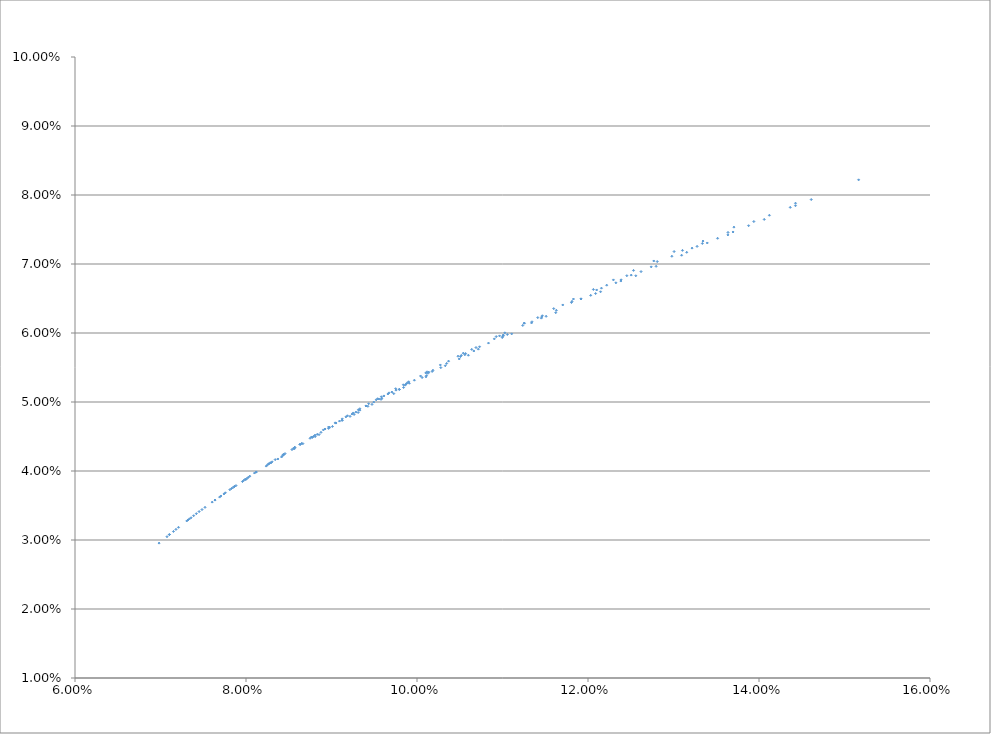
| Category | Series 0 |
|---|---|
| 0.06983636008721791 | 0.03 |
| 0.07321296698508514 | 0.033 |
| 0.0769154832485964 | 0.036 |
| 0.07997785496463364 | 0.039 |
| 0.08415444458381158 | 0.042 |
| 0.08854555599099252 | 0.045 |
| 0.0931208468194771 | 0.048 |
| 0.09728580807658857 | 0.051 |
| 0.10105093368734554 | 0.054 |
| 0.10600837576455632 | 0.057 |
| 0.11107246260650216 | 0.06 |
| 0.11622925557184198 | 0.063 |
| 0.12146694791660281 | 0.066 |
| 0.12558932758280886 | 0.068 |
| 0.13094777209999453 | 0.071 |
| 0.13636271674207887 | 0.074 |
| 0.14061042000080481 | 0.076 |
| 0.1461109918588979 | 0.079 |
| 0.15165218546152728 | 0.082 |
| 0.07520709262090239 | 0.035 |
| 0.07811109997916753 | 0.037 |
| 0.08118475187406657 | 0.04 |
| 0.08440951824992131 | 0.042 |
| 0.08776874411170317 | 0.045 |
| 0.09124758052759108 | 0.047 |
| 0.09425643843711162 | 0.049 |
| 0.09793064063376097 | 0.052 |
| 0.10278917864363259 | 0.055 |
| 0.10664408477517992 | 0.057 |
| 0.1105653165611652 | 0.06 |
| 0.11454606266667294 | 0.062 |
| 0.11918252663538204 | 0.065 |
| 0.12326699303621833 | 0.067 |
| 0.12739470682340148 | 0.07 |
| 0.13217250113139012 | 0.072 |
| 0.1363759343894203 | 0.075 |
| 0.13939632885941655 | 0.076 |
| 0.14426971287956494 | 0.079 |
| 0.08119837997552531 | 0.04 |
| 0.08341408122674225 | 0.042 |
| 0.08570699991151598 | 0.043 |
| 0.08807110520166594 | 0.045 |
| 0.09050081855835633 | 0.047 |
| 0.09403091175341087 | 0.049 |
| 0.09659542915287775 | 0.051 |
| 0.09969356472684747 | 0.053 |
| 0.10346750147447085 | 0.056 |
| 0.10731553341536762 | 0.058 |
| 0.11009419845601366 | 0.06 |
| 0.11466286487225733 | 0.062 |
| 0.11813151836169068 | 0.065 |
| 0.1210141778940968 | 0.066 |
| 0.12454154329315406 | 0.068 |
| 0.12809675105099408 | 0.07 |
| 0.13105163780686468 | 0.072 |
| 0.13344992779212045 | 0.073 |
| 0.13706601014152156 | 0.075 |
| 0.0876831088677513 | 0.045 |
| 0.0890496128885317 | 0.046 |
| 0.09044428812424603 | 0.047 |
| 0.09186585152725013 | 0.048 |
| 0.09434955100851594 | 0.05 |
| 0.09583315446196636 | 0.051 |
| 0.0984058230785593 | 0.052 |
| 0.10102706265197277 | 0.054 |
| 0.10479665394004016 | 0.057 |
| 0.10690201894000263 | 0.058 |
| 0.1102763901833215 | 0.06 |
| 0.11254878838623586 | 0.061 |
| 0.11598892962188571 | 0.064 |
| 0.11830195953426394 | 0.065 |
| 0.12062961984624947 | 0.066 |
| 0.1229710797652963 | 0.068 |
| 0.12532556583883112 | 0.069 |
| 0.12769235751129224 | 0.07 |
| 0.13007078303965222 | 0.072 |
| 0.07210471897982043 | 0.032 |
| 0.07485476774410539 | 0.034 |
| 0.07742456688625336 | 0.037 |
| 0.07958632861285458 | 0.038 |
| 0.0823649968755221 | 0.041 |
| 0.0837297905744902 | 0.042 |
| 0.08566873806577407 | 0.043 |
| 0.08809201803399128 | 0.045 |
| 0.0901147311488465 | 0.046 |
| 0.0926421131939057 | 0.048 |
| 0.09579456346753279 | 0.05 |
| 0.09842869725250963 | 0.052 |
| 0.10110819623747867 | 0.054 |
| 0.1049398266311822 | 0.056 |
| 0.10997292925458417 | 0.059 |
| 0.11510236664970565 | 0.062 |
| 0.12088918502349434 | 0.066 |
| 0.127964603068705 | 0.07 |
| 0.13878423363731474 | 0.076 |
| 0.07419333230184258 | 0.034 |
| 0.07758445596816674 | 0.037 |
| 0.07973149718323909 | 0.039 |
| 0.08250546909206392 | 0.041 |
| 0.08537687091153844 | 0.043 |
| 0.08833620216373828 | 0.045 |
| 0.0897791062581689 | 0.046 |
| 0.09285672760480697 | 0.049 |
| 0.09494673053093337 | 0.05 |
| 0.09754122612676223 | 0.052 |
| 0.10127248585393836 | 0.054 |
| 0.10508246678295992 | 0.057 |
| 0.10836242856405048 | 0.059 |
| 0.11344808579766806 | 0.062 |
| 0.11918252663538204 | 0.065 |
| 0.1262072312480995 | 0.069 |
| 0.1339509079931044 | 0.073 |
| 0.1442684059879261 | 0.078 |
| 0.071805157441001 | 0.032 |
| 0.07637612475291132 | 0.036 |
| 0.0798974665895412 | 0.039 |
| 0.08266606155634061 | 0.041 |
| 0.08553225805840652 | 0.043 |
| 0.08749255554156471 | 0.045 |
| 0.09050081855835633 | 0.047 |
| 0.0925481094665193 | 0.048 |
| 0.09403091175341087 | 0.049 |
| 0.09613250328568182 | 0.051 |
| 0.09873246331793796 | 0.053 |
| 0.10137943227481386 | 0.054 |
| 0.10517771630009919 | 0.057 |
| 0.10904722628878037 | 0.059 |
| 0.11237009253933523 | 0.061 |
| 0.11806758660124296 | 0.064 |
| 0.1250564254944429 | 0.068 |
| 0.13276145210145693 | 0.073 |
| 0.14365339760581322 | 0.078 |
| 0.07307488334763368 | 0.033 |
| 0.07864525492247328 | 0.038 |
| 0.0828466572633457 | 0.041 |
| 0.08570699991151598 | 0.043 |
| 0.08924613332408206 | 0.046 |
| 0.09126327962736273 | 0.048 |
| 0.0933130742349257 | 0.049 |
| 0.09539341254925009 | 0.05 |
| 0.09750233952166622 | 0.052 |
| 0.09901946513785995 | 0.053 |
| 0.10117583183396239 | 0.054 |
| 0.10273358083906191 | 0.055 |
| 0.10541585800032129 | 0.057 |
| 0.10926187459624649 | 0.059 |
| 0.11254878838623586 | 0.061 |
| 0.11705038572735076 | 0.064 |
| 0.1221867235269687 | 0.067 |
| 0.12981082858643442 | 0.071 |
| 0.07104134139625641 | 0.031 |
| 0.07338167223812109 | 0.033 |
| 0.07451899541465616 | 0.034 |
| 0.07706547687248512 | 0.036 |
| 0.07883027912738473 | 0.038 |
| 0.08011184513258454 | 0.039 |
| 0.08290517941054008 | 0.041 |
| 0.08427209422773109 | 0.042 |
| 0.08665273367164993 | 0.044 |
| 0.08965897359113091 | 0.046 |
| 0.09217025343647955 | 0.048 |
| 0.09473662724814456 | 0.05 |
| 0.09793064063376097 | 0.052 |
| 0.10059720167397965 | 0.054 |
| 0.10330649759338029 | 0.055 |
| 0.10717566761488692 | 0.058 |
| 0.1133965409596603 | 0.061 |
| 0.12031581829489889 | 0.065 |
| 0.070762003919566 | 0.03 |
| 0.0738779120938744 | 0.034 |
| 0.07637612475291132 | 0.036 |
| 0.07846601618025598 | 0.038 |
| 0.08026657934463673 | 0.039 |
| 0.08305490100544746 | 0.041 |
| 0.08440951824992131 | 0.042 |
| 0.08635398561765548 | 0.044 |
| 0.08876959764895355 | 0.046 |
| 0.09124758052759108 | 0.047 |
| 0.09331638573374304 | 0.049 |
| 0.09588979476083766 | 0.051 |
| 0.0991006490417232 | 0.053 |
| 0.10177208467573576 | 0.054 |
| 0.10559740226815872 | 0.057 |
| 0.1100259335774241 | 0.06 |
| 0.11630110484356831 | 0.063 |
| 0.12384121000109007 | 0.068 |
| 0.13696593198168544 | 0.075 |
| 0.07151640530641555 | 0.031 |
| 0.07604612397026823 | 0.035 |
| 0.07864525492247328 | 0.038 |
| 0.08044193789416654 | 0.039 |
| 0.08266606155634061 | 0.041 |
| 0.08456662024805307 | 0.043 |
| 0.0865076788898437 | 0.044 |
| 0.08791048410471339 | 0.045 |
| 0.09093417594936323 | 0.047 |
| 0.09240411967761195 | 0.048 |
| 0.09553691374725021 | 0.05 |
| 0.0970650355964605 | 0.051 |
| 0.09861424900163072 | 0.052 |
| 0.10187027349216367 | 0.055 |
| 0.10568425167209738 | 0.057 |
| 0.11009419845601366 | 0.06 |
| 0.11459713667848008 | 0.062 |
| 0.12387521026057774 | 0.068 |
| 0.13515583326200695 | 0.074 |
| 0.07357286653043568 | 0.033 |
| 0.07830186371843559 | 0.037 |
| 0.08099346656797218 | 0.04 |
| 0.08436138097356519 | 0.042 |
| 0.08628662813749897 | 0.044 |
| 0.08766351080304732 | 0.045 |
| 0.08965669042847588 | 0.046 |
| 0.09168414732464529 | 0.048 |
| 0.09314314209466983 | 0.049 |
| 0.09522708158936243 | 0.05 |
| 0.09673339928576855 | 0.051 |
| 0.09886755839424126 | 0.053 |
| 0.10041632831827586 | 0.054 |
| 0.10369318980088225 | 0.056 |
| 0.10640083028227384 | 0.058 |
| 0.1096595726404094 | 0.06 |
| 0.11412667826609534 | 0.062 |
| 0.12157065084263186 | 0.066 |
| 0.13337354802348053 | 0.073 |
| 0.07104134139625641 | 0.031 |
| 0.141215184299722 | 0.077 |
| 0.1315485120283679 | 0.072 |